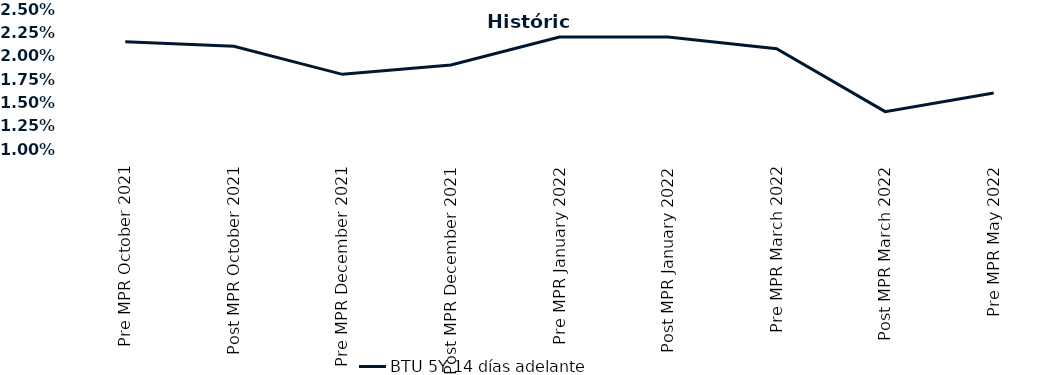
| Category | BTU 5Y 14 días adelante |
|---|---|
| Pre MPR October 2021 | 0.022 |
| Post MPR October 2021 | 0.021 |
| Pre MPR December 2021 | 0.018 |
| Post MPR December 2021 | 0.019 |
| Pre MPR January 2022 | 0.022 |
| Post MPR January 2022 | 0.022 |
| Pre MPR March 2022 | 0.021 |
| Post MPR March 2022 | 0.014 |
| Pre MPR May 2022 | 0.016 |